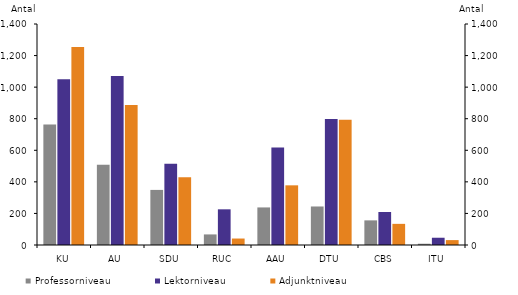
| Category | Professorniveau | Lektorniveau | Adjunktniveau |
|---|---|---|---|
| KU | 763 | 1050 | 1254 |
| AU | 508 | 1071 | 887 |
| SDU | 349 | 514 | 429 |
| RUC | 67 | 226 | 41 |
| AAU | 238 | 618 | 378 |
| DTU | 244 | 798 | 794 |
| CBS | 156 | 209 | 134 |
| ITU | 8 | 46 | 31 |